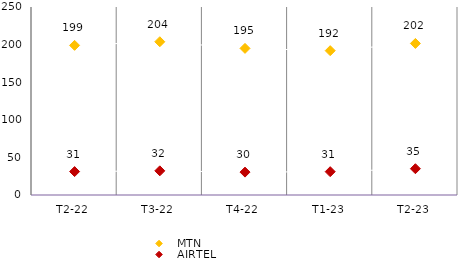
| Category | MTN | AIRTEL |
|---|---|---|
| T2-22 | 198.998 | 31.134 |
| T3-22 | 203.809 | 32.141 |
| T4-22 | 194.967 | 30.439 |
| T1-23 | 191.946 | 31.001 |
| T2-23 | 201.557 | 34.956 |